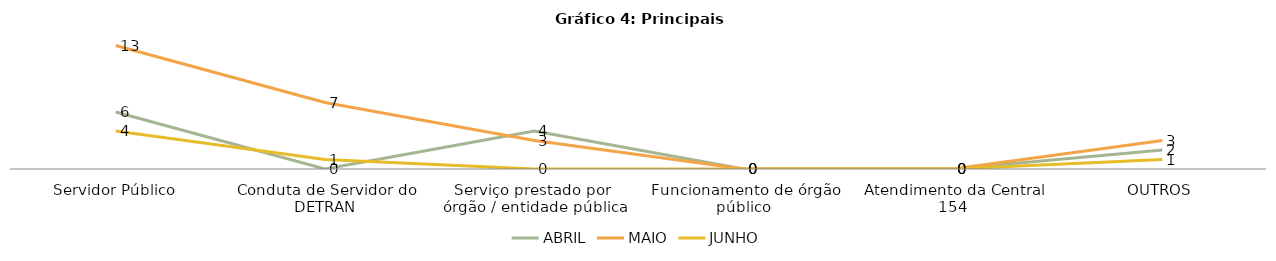
| Category | ABRIL | MAIO | JUNHO |
|---|---|---|---|
| Servidor Público | 6 | 13 | 4 |
| Conduta de Servidor do DETRAN | 0 | 7 | 1 |
| Serviço prestado por  órgão / entidade pública | 4 | 3 | 0 |
| Funcionamento de órgão público | 0 | 0 | 0 |
| Atendimento da Central 154 | 0 | 0 | 0 |
| OUTROS | 2 | 3 | 1 |